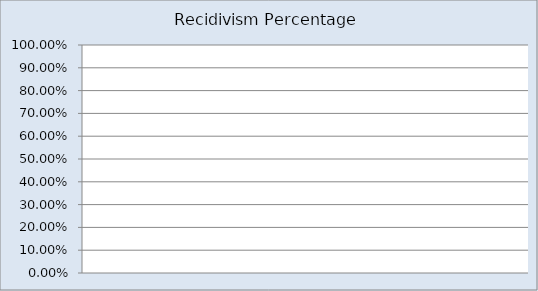
| Category | Recidivism Percentage |
|---|---|
| 0 | 0 |
| 1 | 0 |
| 2 | 0 |
| 3 | 0 |
| 4 | 0 |
| 5 | 0 |
| 6 | 0 |
| 7 | 0 |
| 8 | 0 |
| 9 | 0 |
| 10 | 0 |
| 11 | 0 |
| 12 | 0 |
| 13 | 0 |
| 14 | 0 |
| 15 | 0 |
| 16 | 0 |
| 17 | 0 |
| 18 | 0 |
| 19 | 0 |
| 20 | 0 |
| 21 | 0 |
| 22 | 0 |
| 23 | 0 |
| 24 | 0 |
| 25 | 0 |
| 26 | 0 |
| 27 | 0 |
| 28 | 0 |
| 29 | 0 |
| 30 | 0 |
| 31 | 0 |
| 32 | 0 |
| 33 | 0 |
| 34 | 0 |
| 35 | 0 |